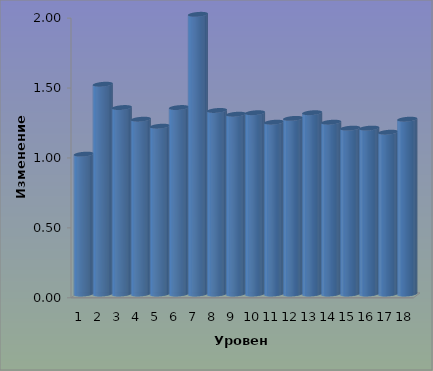
| Category | Скачок М |
|---|---|
| 0 | 1 |
| 1 | 1.5 |
| 2 | 1.333 |
| 3 | 1.25 |
| 4 | 1.2 |
| 5 | 1.333 |
| 6 | 2 |
| 7 | 1.312 |
| 8 | 1.286 |
| 9 | 1.296 |
| 10 | 1.229 |
| 11 | 1.256 |
| 12 | 1.296 |
| 13 | 1.229 |
| 14 | 1.186 |
| 15 | 1.186 |
| 16 | 1.157 |
| 17 | 1.25 |